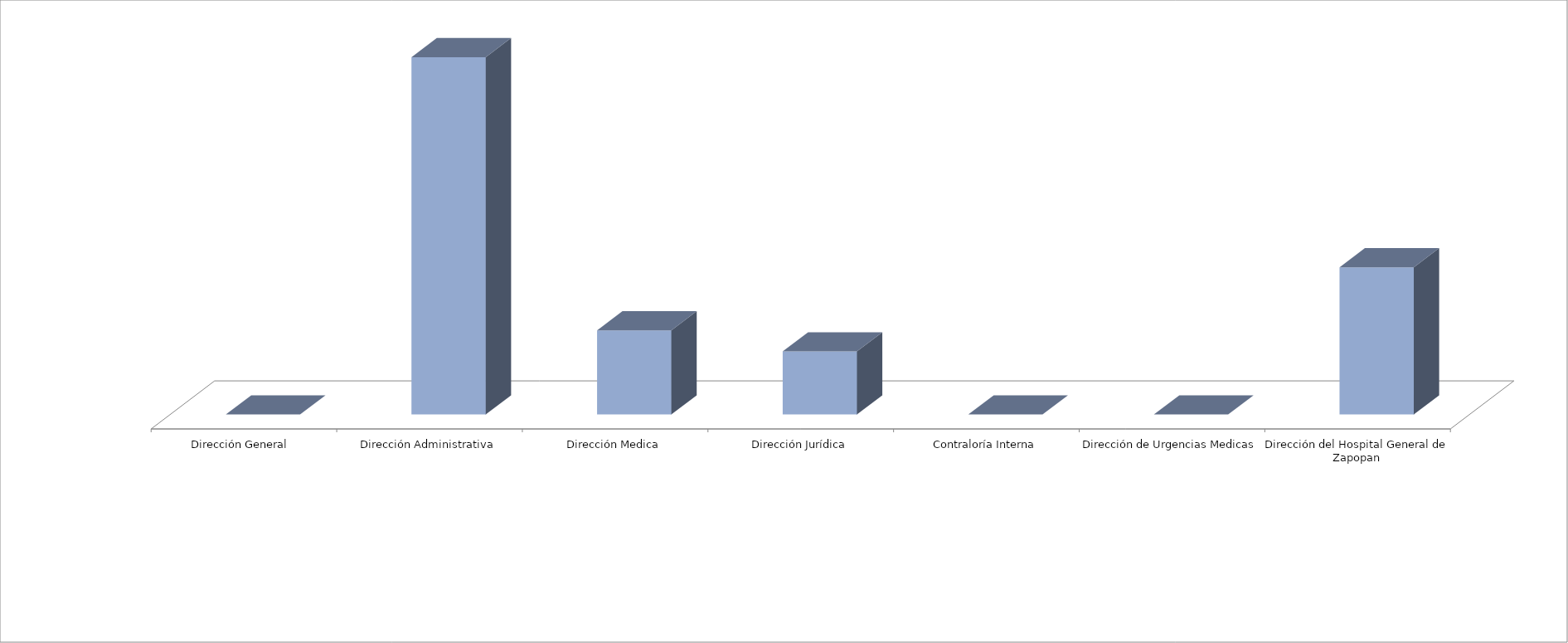
| Category | Series 0 | Series 1 |
|---|---|---|
| Dirección General  |  | 0 |
| Dirección Administrativa |  | 17 |
| Dirección Medica |  | 4 |
| Dirección Jurídica |  | 3 |
| Contraloría Interna |  | 0 |
| Dirección de Urgencias Medicas |  | 0 |
| Dirección del Hospital General de Zapopan |  | 7 |